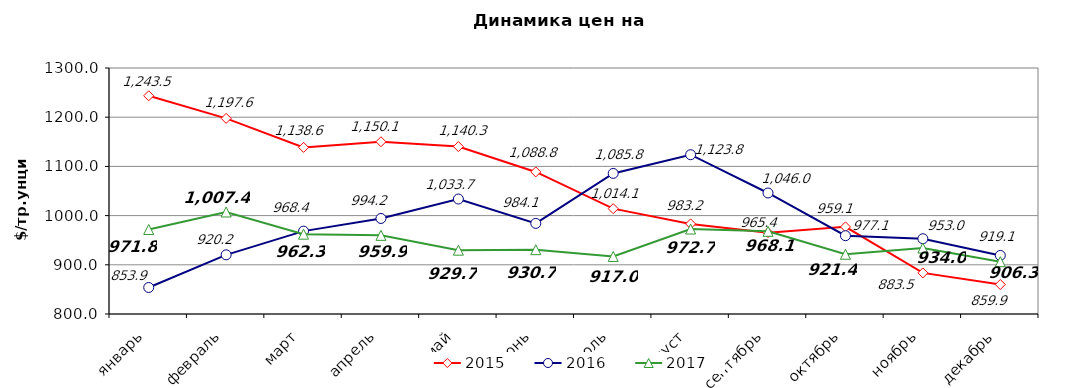
| Category | 2015 | 2016 | 2017 |
|---|---|---|---|
| январь | 1243.48 | 853.85 | 971.76 |
| февраль | 1197.6 | 920.24 | 1007.35 |
| март | 1138.64 | 968.43 | 962.26 |
| апрель | 1150.1 | 994.19 | 959.89 |
| май | 1140.26 | 1033.7 | 929.71 |
| июнь | 1088.77 | 984.14 | 930.73 |
| июль | 1014.09 | 1085.76 | 916.95 |
| август | 983.15 | 1123.77 | 972.67 |
| сентябрь | 965.36 | 1045.95 | 968.1 |
| октябрь | 977.09 | 959.14 | 921.43 |
| ноябрь | 883.52 | 953 | 934 |
| декабрь | 859.9 | 919.05 | 906.32 |